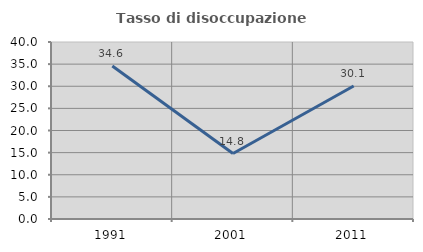
| Category | Tasso di disoccupazione giovanile  |
|---|---|
| 1991.0 | 34.579 |
| 2001.0 | 14.796 |
| 2011.0 | 30.053 |